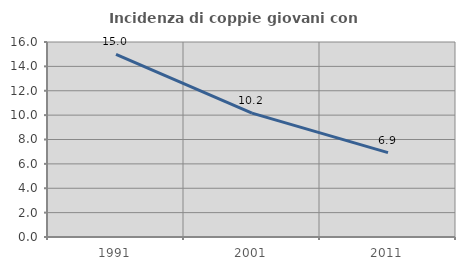
| Category | Incidenza di coppie giovani con figli |
|---|---|
| 1991.0 | 14.984 |
| 2001.0 | 10.164 |
| 2011.0 | 6.928 |